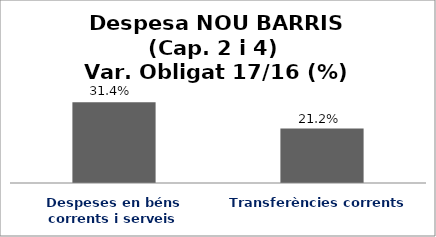
| Category | Series 0 |
|---|---|
| Despeses en béns corrents i serveis | 0.314 |
| Transferències corrents | 0.212 |